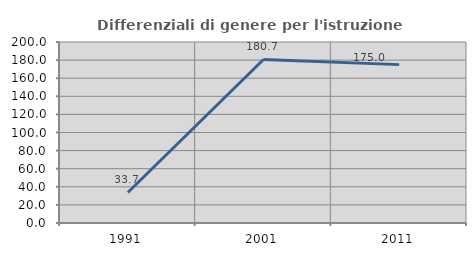
| Category | Differenziali di genere per l'istruzione superiore |
|---|---|
| 1991.0 | 33.712 |
| 2001.0 | 180.676 |
| 2011.0 | 175 |